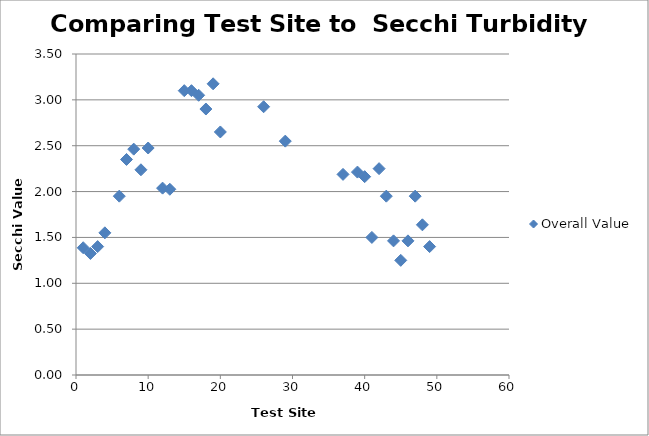
| Category | Overall Value |
|---|---|
| 1.0 | 1.388 |
| 2.0 | 1.325 |
| 3.0 | 1.4 |
| 4.0 | 1.55 |
| 6.0 | 1.95 |
| 7.0 | 2.35 |
| 8.0 | 2.463 |
| 9.0 | 2.238 |
| 10.0 | 2.475 |
| 12.0 | 2.038 |
| 13.0 | 2.025 |
| 15.0 | 3.1 |
| 16.0 | 3.1 |
| 17.0 | 3.05 |
| 18.0 | 2.9 |
| 19.0 | 3.175 |
| 20.0 | 2.65 |
| 26.0 | 2.925 |
| 29.0 | 2.55 |
| 37.0 | 2.188 |
| 39.0 | 2.212 |
| 40.0 | 2.162 |
| 41.0 | 1.5 |
| 42.0 | 2.25 |
| 43.0 | 1.95 |
| 44.0 | 1.462 |
| 45.0 | 1.25 |
| 46.0 | 1.462 |
| 47.0 | 1.95 |
| 48.0 | 1.638 |
| 49.0 | 1.4 |